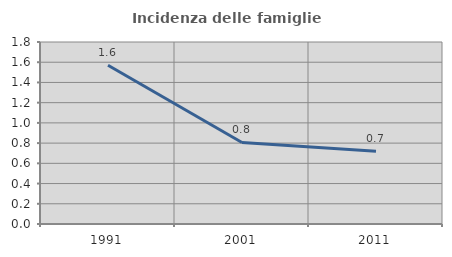
| Category | Incidenza delle famiglie numerose |
|---|---|
| 1991.0 | 1.57 |
| 2001.0 | 0.806 |
| 2011.0 | 0.719 |